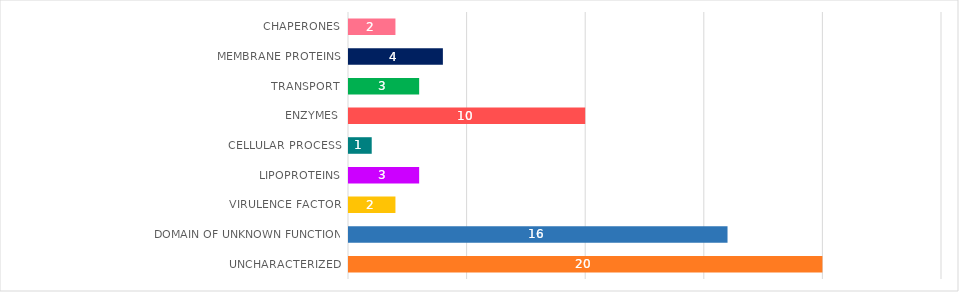
| Category | Series 0 |
|---|---|
| Uncharacterized | 20 |
| Domain of unknown function | 16 |
| virulence factor | 2 |
| Lipoproteins | 3 |
| Cellular process | 1 |
| Enzymes | 10 |
| Transport | 3 |
| Membrane proteins | 4 |
| Chaperones | 2 |